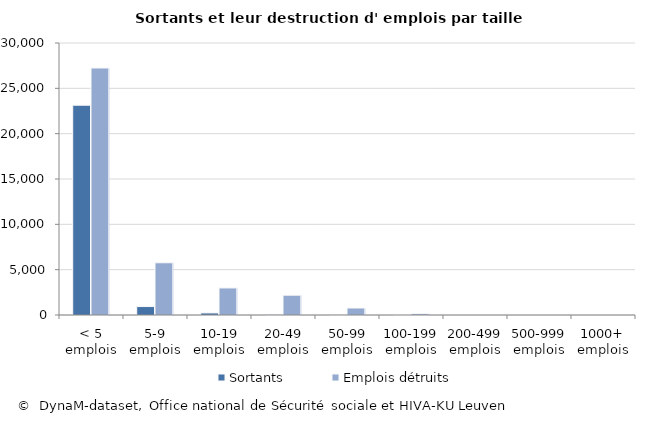
| Category | Sortants | Emplois détruits |
|---|---|---|
| < 5 emplois | 23139 | 27244 |
| 5-9 emplois | 932 | 5760 |
| 10-19 emplois | 228 | 2984 |
| 20-49 emplois | 75 | 2184 |
| 50-99 emplois | 13 | 772 |
| 100-199 emplois | 1 | 154 |
| 200-499 emplois | 0 | 0 |
| 500-999 emplois | 0 | 0 |
| 1000+ emplois | 0 | 0 |